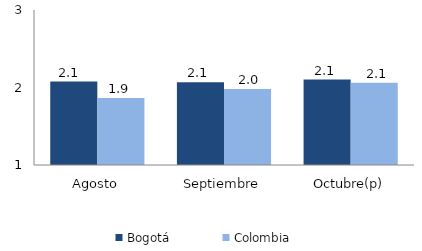
| Category | Bogotá | Colombia |
|---|---|---|
| Agosto | 2.077 | 1.865 |
| Septiembre | 2.068 | 1.982 |
| Octubre(p) | 2.103 | 2.063 |